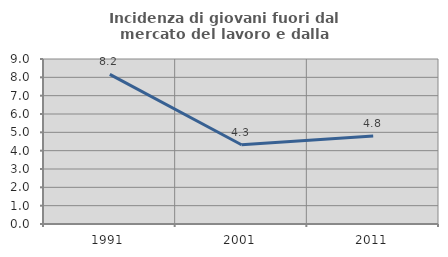
| Category | Incidenza di giovani fuori dal mercato del lavoro e dalla formazione  |
|---|---|
| 1991.0 | 8.163 |
| 2001.0 | 4.321 |
| 2011.0 | 4.795 |